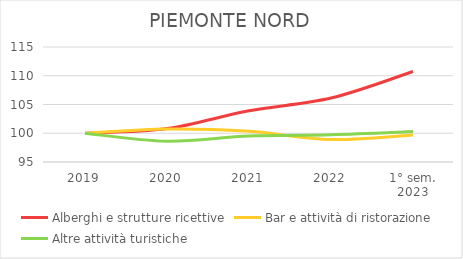
| Category | Alberghi e strutture ricettive | Bar e attività di ristorazione | Altre attività turistiche |
|---|---|---|---|
| 2019 | 100 | 100 | 100 |
| 2020 | 100.808 | 100.747 | 98.608 |
| 2021 | 103.926 | 100.334 | 99.516 |
| 2022 | 106.12 | 98.919 | 99.758 |
| 1° sem.
2023 | 110.739 | 99.698 | 100.303 |